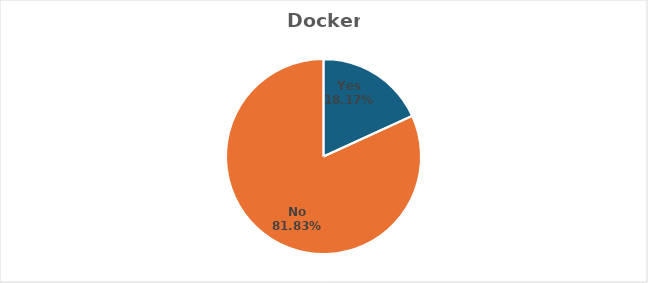
| Category | TRUE |
|---|---|
| 0 | 0.182 |
| 1 | 0.818 |